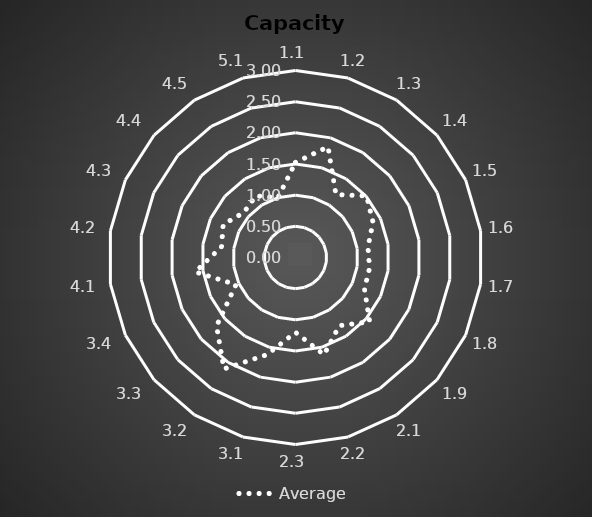
| Category | Average |
|---|---|
| 1.1 | 1.525 |
| 1.2 | 1.85 |
| 1.3 | 1.2 |
| 1.4 | 1.508 |
| 1.5 | 1.367 |
| 1.6 | 1.175 |
| 1.7 | 1.2 |
| 1.8 | 1.217 |
| 1.9 | 1.575 |
| 2.1 | 1.3 |
| 2.2 | 1.625 |
| 2.3 | 1.2 |
| 3.1 | 1.625 |
| 3.2 | 2.125 |
| 3.3 | 1.675 |
| 3.4 | 1.05 |
| 4.1 | 1.625 |
| 4.2 | 1.2 |
| 4.3 | 1.275 |
| 4.4 | 1.1 |
| 4.5 | 1.175 |
| 5.1 | 1 |